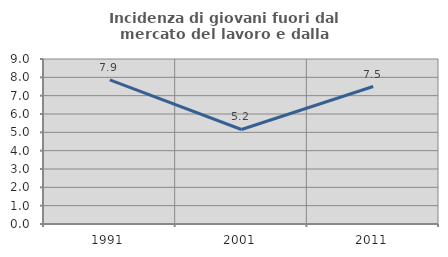
| Category | Incidenza di giovani fuori dal mercato del lavoro e dalla formazione  |
|---|---|
| 1991.0 | 7.857 |
| 2001.0 | 5.155 |
| 2011.0 | 7.5 |